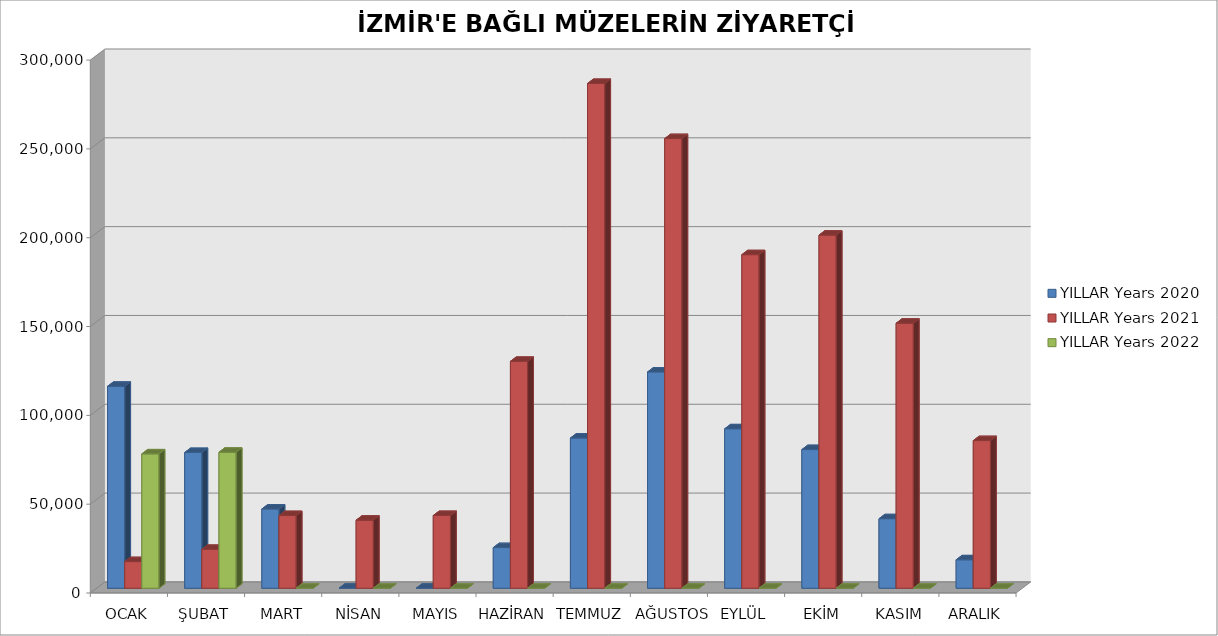
| Category | YILLAR Years 2020 | YILLAR Years 2021 | YILLAR Years 2022 |
|---|---|---|---|
| OCAK | 113675 | 14992 | 75648 |
| ŞUBAT | 76403 | 21877 | 76569 |
| MART | 44613 | 40903 | 0 |
| NİSAN | 0 | 38306 | 0 |
| MAYIS | 0 | 40946 | 0 |
| HAZİRAN | 22885 | 127729 | 0 |
| TEMMUZ | 84548 | 284174 | 0 |
| AĞUSTOS | 121753 | 253129 | 0 |
| EYLÜL | 89757 | 187775 | 0 |
| EKİM | 78061 | 198786 | 0 |
| KASIM | 39134 | 149190 | 0 |
| ARALIK | 16010 | 83118 | 0 |